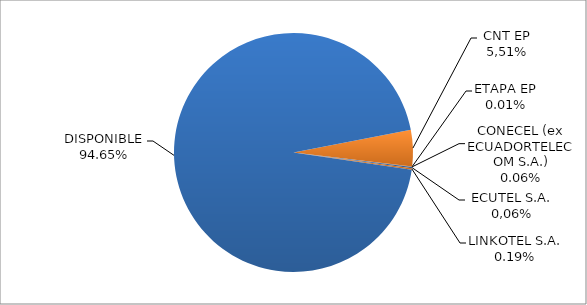
| Category | CODIGO DE AREA 5 |
|---|---|
| CORPORACIÓN NACIONAL TELECOMUNICACIONES CNT EP | 0.049 |
| ETAPA EP | 0 |
| CONECEL (ex ECUADORTELECOM S.A.) | 0.001 |
| SETEL S.A. | 0.002 |
| LINKOTEL S.A. | 0.002 |
| DISPONIBLE | 0.947 |